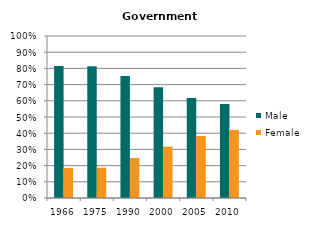
| Category | Male | Female |
|---|---|---|
| 1966.0 | 0.814 | 0.186 |
| 1975.0 | 0.813 | 0.187 |
| 1990.0 | 0.753 | 0.247 |
| 2000.0 | 0.683 | 0.317 |
| 2005.0 | 0.617 | 0.383 |
| 2010.0 | 0.58 | 0.42 |